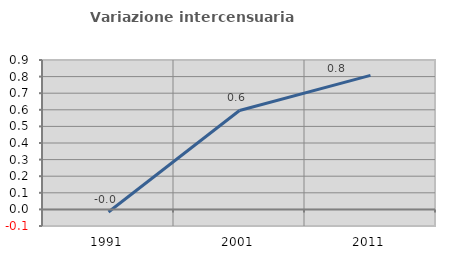
| Category | Variazione intercensuaria annua |
|---|---|
| 1991.0 | -0.016 |
| 2001.0 | 0.596 |
| 2011.0 | 0.808 |